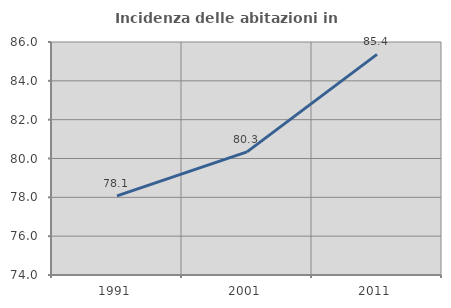
| Category | Incidenza delle abitazioni in proprietà  |
|---|---|
| 1991.0 | 78.071 |
| 2001.0 | 80.34 |
| 2011.0 | 85.364 |